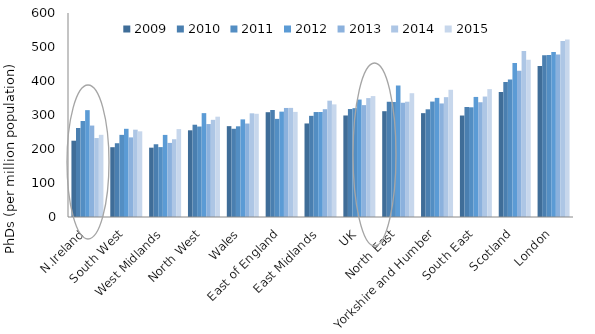
| Category | 2009 | 2010 | 2011 | 2012 | 2013 | 2014 | 2015 |
|---|---|---|---|---|---|---|---|
| N.Ireland | 224.402 | 261.809 | 282.408 | 314.259 | 268.949 | 232.232 | 241.663 |
| South West | 205.272 | 216.948 | 241.591 | 259.409 | 234.175 | 256.799 | 251.994 |
| West Midlands | 203.92 | 213.953 | 205.579 | 241.422 | 217.913 | 228.656 | 258.589 |
| North West | 254.989 | 271.4 | 266.081 | 305.492 | 273.377 | 285.762 | 295.03 |
| Wales | 267.213 | 259.482 | 266.745 | 287.114 | 274.903 | 304.927 | 303.546 |
| East of England | 308.227 | 314.718 | 288.626 | 309.86 | 320.683 | 320.908 | 309.11 |
| East Midlands | 275.121 | 297.527 | 308.689 | 308.803 | 316.988 | 342.1 | 331.259 |
| UK | 298.6 | 317.531 | 320.148 | 345.446 | 329.042 | 349.716 | 355.609 |
| North East | 311.183 | 338.931 | 338.162 | 386.899 | 336.045 | 339.099 | 364.078 |
| Yorkshire and Humber | 305.435 | 316.743 | 339.496 | 350.338 | 333.955 | 352.465 | 374.145 |
| South East | 298.445 | 323.595 | 322.647 | 353.13 | 337.51 | 354.273 | 376.123 |
| Scotland | 367.717 | 397.177 | 404.622 | 453.291 | 430.099 | 488.554 | 462.56 |
| London | 444.086 | 475.964 | 476.626 | 485.356 | 477.824 | 517.657 | 521.74 |